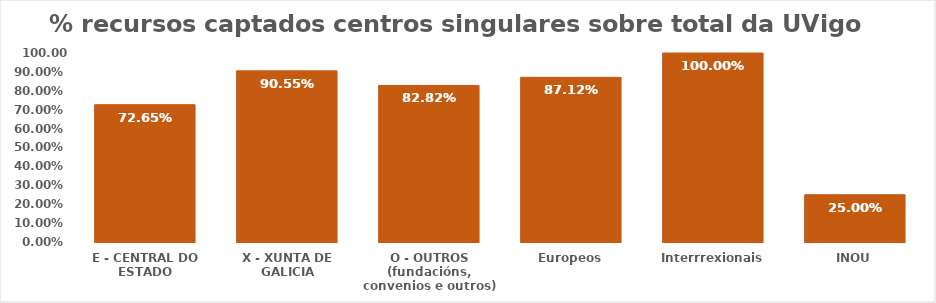
| Category | Series 0 |
|---|---|
| E - CENTRAL DO ESTADO | 0.726 |
| X - XUNTA DE GALICIA | 0.906 |
| O - OUTROS (fundacións, convenios e outros) | 0.828 |
| Europeos | 0.871 |
| Interrrexionais | 1 |
| INOU | 0.25 |